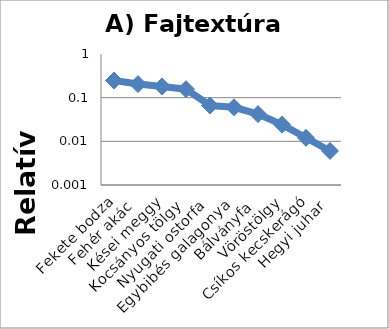
| Category | Series 0 |
|---|---|
| Fekete bodza | 0.247 |
| Fehér akác | 0.205 |
| Kései meggy | 0.181 |
| Kocsányos tölgy | 0.157 |
| Nyugati ostorfa | 0.066 |
| Egybibés galagonya | 0.06 |
| Bálványfa | 0.042 |
| Vöröstölgy | 0.024 |
| Csíkos kecskerágó | 0.012 |
| Hegyi juhar | 0.006 |